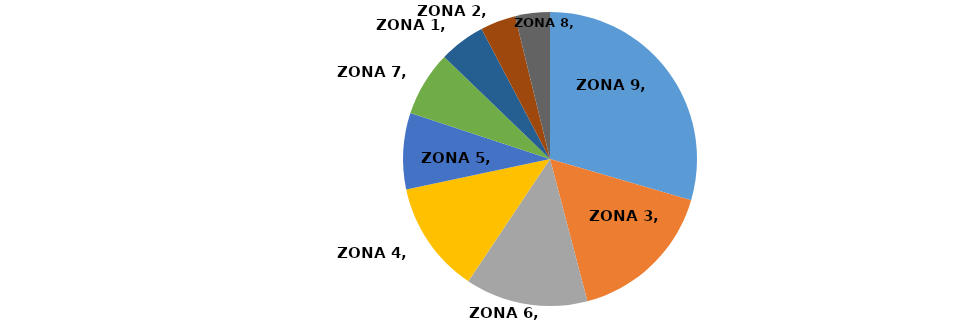
| Category | Series 0 |
|---|---|
| ZONA 9 | 0.295 |
| ZONA 3 | 0.164 |
| ZONA 6 | 0.135 |
| ZONA 4 | 0.123 |
| ZONA 5 | 0.084 |
| ZONA 7 | 0.072 |
| ZONA 1 | 0.051 |
| ZONA 2 | 0.039 |
| ZONA 8 | 0.038 |